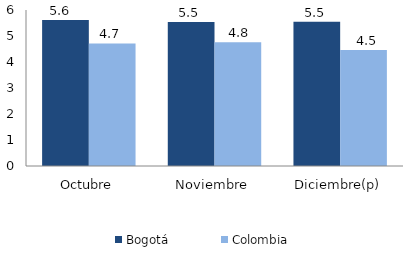
| Category | Bogotá | Colombia |
|---|---|---|
| Octubre | 5.617 | 4.715 |
| Noviembre | 5.535 | 4.755 |
| Diciembre(p) | 5.545 | 4.466 |